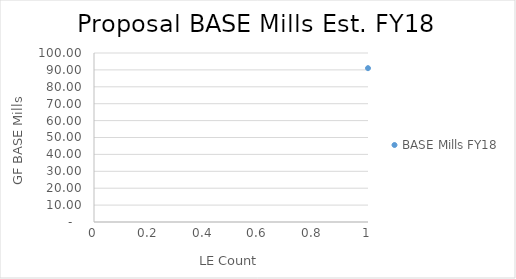
| Category | BASE Mills FY18 |
|---|---|
| 0 | 91.03 |
| 1 | 53.27 |
| 2 | 45.19 |
| 3 | 52.34 |
| 4 | 50.68 |
| 5 | 52.06 |
| 6 | 40.44 |
| 7 | 55.99 |
| 8 | 27.85 |
| 9 | 32.35 |
| 10 | 65.26 |
| 11 | 38.04 |
| 12 | 35.11 |
| 13 | 31.2 |
| 14 | 30.46 |
| 15 | 19.63 |
| 16 | 28.94 |
| 17 | 36.59 |
| 18 | 43.14 |
| 19 | 45.29 |
| 20 | 25.79 |
| 21 | 61.94 |
| 22 | 37.99 |
| 23 | 29.81 |
| 24 | 24.91 |
| 25 | 23.28 |
| 26 | 40.8 |
| 27 | 14.33 |
| 28 | 34.25 |
| 29 | 33.53 |
| 30 | 28.19 |
| 31 | 31.8 |
| 32 | 38.83 |
| 33 | 57.28 |
| 34 | 30.04 |
| 35 | 20.26 |
| 36 | 30.17 |
| 37 | 45.66 |
| 38 | 57.2 |
| 39 | 26.93 |
| 40 | 30.84 |
| 41 | 16.71 |
| 42 | 33.64 |
| 43 | 27.07 |
| 44 | 37.07 |
| 45 | 48.45 |
| 46 | 29.81 |
| 47 | 37.12 |
| 48 | 53.68 |
| 49 | 12.35 |
| 50 | 34.51 |
| 51 | 22.52 |
| 52 | 57.27 |
| 53 | 33.42 |
| 54 | 8.92 |
| 55 | 23.59 |
| 56 | 32.52 |
| 57 | 8.78 |
| 58 | 22.91 |
| 59 | 27.14 |
| 60 | 29.68 |
| 61 | 33.73 |
| 62 | 18.24 |
| 63 | 37.59 |
| 64 | 44.73 |
| 65 | 34.19 |
| 66 | 55.81 |
| 67 | 16.02 |
| 68 | 36.86 |
| 69 | 56.55 |
| 70 | 56.09 |
| 71 | 35.01 |
| 72 | 26.29 |
| 73 | 39.61 |
| 74 | 26.16 |
| 75 | 32.23 |
| 76 | 44.25 |
| 77 | 18.32 |
| 78 | 23.3 |
| 79 | 14.69 |
| 80 | 21.25 |
| 81 | 55.47 |
| 82 | 19.42 |
| 83 | 40.35 |
| 84 | 15.9 |
| 85 | 35.36 |
| 86 | 17.83 |
| 87 | 14.86 |
| 88 | 37.17 |
| 89 | 37.73 |
| 90 | 56.49 |
| 91 | 19.06 |
| 92 | 30.81 |
| 93 | 37.22 |
| 94 | 19.68 |
| 95 | 12.3 |
| 96 | 36.93 |
| 97 | 51.46 |
| 98 | 38.26 |
| 99 | 55.54 |
| 100 | 30.44 |
| 101 | 35.27 |
| 102 | 23.52 |
| 103 | 37.18 |
| 104 | 26.75 |
| 105 | 56.57 |
| 106 | 4.97 |
| 107 | 17.29 |
| 108 | 23.5 |
| 109 | 33.6 |
| 110 | 31.82 |
| 111 | 4.31 |
| 112 | 38.1 |
| 113 | 35.32 |
| 114 | 19.28 |
| 115 | 35.39 |
| 116 | 4.27 |
| 117 | 17.49 |
| 118 | 17.32 |
| 119 | 4.32 |
| 120 | 43.58 |
| 121 | 57.99 |
| 122 | 21.28 |
| 123 | 36.43 |
| 124 | 3.49 |
| 125 | 17.26 |
| 126 | 25.38 |
| 127 | 25.57 |
| 128 | 17.3 |
| 129 | 19.5 |
| 130 | 18.98 |
| 131 | 15.86 |
| 132 | 22.81 |
| 133 | 8.29 |
| 134 | 56.25 |
| 135 | 37.64 |
| 136 | 13.34 |
| 137 | 35.47 |
| 138 | 38.02 |
| 139 | 6.77 |
| 140 | 38.05 |
| 141 | 8.22 |
| 142 | 34.69 |
| 143 | 11.19 |
| 144 | 17.9 |
| 145 | 19.16 |
| 146 | 8.14 |
| 147 | 43.71 |
| 148 | 5.76 |
| 149 | 54.59 |
| 150 | 37.99 |
| 151 | 18.56 |
| 152 | 19.45 |
| 153 | 10.17 |
| 154 | 18.95 |
| 155 | 23.12 |
| 156 | 36.48 |
| 157 | 20.98 |
| 158 | 32.75 |
| 159 | 34.38 |
| 160 | 16.71 |
| 161 | 37.56 |
| 162 | 19.26 |
| 163 | 56.35 |
| 164 | 26.89 |
| 165 | 14.82 |
| 166 | 1.84 |
| 167 | 39.14 |
| 168 | 6.39 |
| 169 | 13.77 |
| 170 | 37.22 |
| 171 | 14.8 |
| 172 | 19.37 |
| 173 | 37.6 |
| 174 | 19.35 |
| 175 | 18.94 |
| 176 | 19.4 |
| 177 | 16.9 |
| 178 | 57.12 |
| 179 | 18.09 |
| 180 | 37.46 |
| 181 | 37.96 |
| 182 | 17.6 |
| 183 | 19.05 |
| 184 | 36.09 |
| 185 | 37.71 |
| 186 | 55.54 |
| 187 | 20 |
| 188 | 33.49 |
| 189 | 0.97 |
| 190 | 3.87 |
| 191 | 6.88 |
| 192 | 34.5 |
| 193 | 2.9 |
| 194 | 19.52 |
| 195 | 33.65 |
| 196 | 1.38 |
| 197 | 36.89 |
| 198 | 19.32 |
| 199 | 57.42 |
| 200 | 57.78 |
| 201 | 36.32 |
| 202 | 57.75 |
| 203 | 52.94 |
| 204 | 54.6 |
| 205 | 19.72 |
| 206 | 2.5 |
| 207 | 0.22 |
| 208 | 19.31 |
| 209 | 17.33 |
| 210 | 19.03 |
| 211 | 22.08 |
| 212 | 19.64 |
| 213 | 0 |
| 214 | 0 |
| 215 | 0 |
| 216 | 0 |
| 217 | 0 |
| 218 | 0 |
| 219 | 0 |
| 220 | 0 |
| 221 | 0 |
| 222 | 16.79 |
| 223 | 22.42 |
| 224 | 19.87 |
| 225 | 18.12 |
| 226 | 38 |
| 227 | 34.46 |
| 228 | 37.86 |
| 229 | 18.95 |
| 230 | 36.4 |
| 231 | 19.45 |
| 232 | 19.3 |
| 233 | 18.96 |
| 234 | 37.38 |
| 235 | 37.69 |
| 236 | 17.42 |
| 237 | 19.8 |
| 238 | 16.41 |
| 239 | 19.85 |
| 240 | 38.26 |
| 241 | 32.39 |
| 242 | 37.29 |
| 243 | 35.39 |
| 244 | 19.8 |
| 245 | 19.68 |
| 246 | 19.72 |
| 247 | 19.4 |
| 248 | 19.53 |
| 249 | 19.15 |
| 250 | 36.46 |
| 251 | 30.91 |
| 252 | 19.71 |
| 253 | 32.56 |
| 254 | 19.72 |
| 255 | 19.79 |
| 256 | 18.75 |
| 257 | 29.02 |
| 258 | 18.06 |
| 259 | 34.79 |
| 260 | 37.55 |
| 261 | 19.66 |
| 262 | 38.18 |
| 263 | 37.61 |
| 264 | 20.19 |
| 265 | 30.76 |
| 266 | 37.39 |
| 267 | 19.58 |
| 268 | 19.35 |
| 269 | 19.04 |
| 270 | 37.43 |
| 271 | 37.85 |
| 272 | 24.8 |
| 273 | 36.66 |
| 274 | 19.84 |
| 275 | 37.25 |
| 276 | 37.52 |
| 277 | 19.96 |
| 278 | 19.12 |
| 279 | 37.53 |
| 280 | 37.2 |
| 281 | 35.54 |
| 282 | 36.7 |
| 283 | 19.73 |
| 284 | 37.06 |
| 285 | 36.16 |
| 286 | 18.96 |
| 287 | 37.32 |
| 288 | 19.71 |
| 289 | 19.8 |
| 290 | 37.97 |
| 291 | 19.7 |
| 292 | 19.24 |
| 293 | 41.28 |
| 294 | 19.55 |
| 295 | 36.91 |
| 296 | 37.99 |
| 297 | 37.39 |
| 298 | 35.47 |
| 299 | 19.48 |
| 300 | 38.25 |
| 301 | 19.46 |
| 302 | 37.28 |
| 303 | 37.97 |
| 304 | 57.02 |
| 305 | 19.2 |
| 306 | 19.37 |
| 307 | 55.19 |
| 308 | 52.61 |
| 309 | 36.6 |
| 310 | 36.99 |
| 311 | 37.53 |
| 312 | 54.58 |
| 313 | 33.87 |
| 314 | 37.35 |
| 315 | 20.05 |
| 316 | 20.3 |
| 317 | 19.23 |
| 318 | 37.75 |
| 319 | 36.7 |
| 320 | 38.17 |
| 321 | 36.78 |
| 322 | 37.41 |
| 323 | 27.69 |
| 324 | 19.6 |
| 325 | 37.65 |
| 326 | 37.93 |
| 327 | 37.9 |
| 328 | 38.01 |
| 329 | 38.11 |
| 330 | 19.52 |
| 331 | 20.04 |
| 332 | 36.9 |
| 333 | 37.83 |
| 334 | 37.27 |
| 335 | 20.37 |
| 336 | 37.68 |
| 337 | 35.92 |
| 338 | 38.27 |
| 339 | 37.66 |
| 340 | 38.02 |
| 341 | 27.85 |
| 342 | 18.39 |
| 343 | 37.41 |
| 344 | 19.88 |
| 345 | 35.92 |
| 346 | 55.11 |
| 347 | 19.3 |
| 348 | 36.91 |
| 349 | 57.69 |
| 350 | 37.97 |
| 351 | 37.93 |
| 352 | 36.36 |
| 353 | 37.85 |
| 354 | 37.31 |
| 355 | 35.94 |
| 356 | 37.82 |
| 357 | 37.64 |
| 358 | 56.39 |
| 359 | 31.57 |
| 360 | 36.08 |
| 361 | 38.53 |
| 362 | 37.14 |
| 363 | 37.94 |
| 364 | 36.25 |
| 365 | 29.8 |
| 366 | 37.85 |
| 367 | 55.83 |
| 368 | 37.36 |
| 369 | 35.63 |
| 370 | 37.93 |
| 371 | 37.71 |
| 372 | 35.86 |
| 373 | 39.12 |
| 374 | 36.34 |
| 375 | 37.7 |
| 376 | 38.12 |
| 377 | 35.04 |
| 378 | 38.38 |
| 379 | 38.19 |
| 380 | 37.54 |
| 381 | 39.62 |
| 382 | 37.63 |
| 383 | 38.21 |
| 384 | 37.36 |
| 385 | 37.81 |
| 386 | 38.1 |
| 387 | 37.73 |
| 388 | 37.2 |
| 389 | 37.45 |
| 390 | 37.58 |
| 391 | 57.21 |
| 392 | 37.9 |
| 393 | 37.48 |
| 394 | 57.52 |
| 395 | 38.15 |
| 396 | 38.21 |
| 397 | 38.01 |
| 398 | 38.26 |
| 399 | 38.65 |
| 400 | 57.81 |
| 401 | 37.86 |
| 402 | 38.1 |
| 403 | 57.45 |
| 404 | 57.99 |
| 405 | 57.91 |
| 406 | 58.15 |